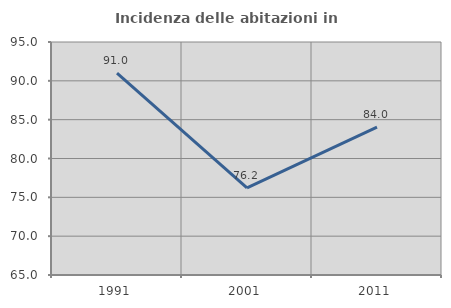
| Category | Incidenza delle abitazioni in proprietà  |
|---|---|
| 1991.0 | 90.977 |
| 2001.0 | 76.224 |
| 2011.0 | 84.028 |